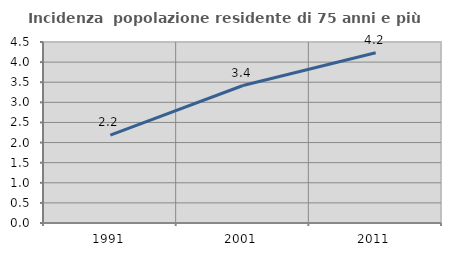
| Category | Incidenza  popolazione residente di 75 anni e più |
|---|---|
| 1991.0 | 2.185 |
| 2001.0 | 3.418 |
| 2011.0 | 4.232 |